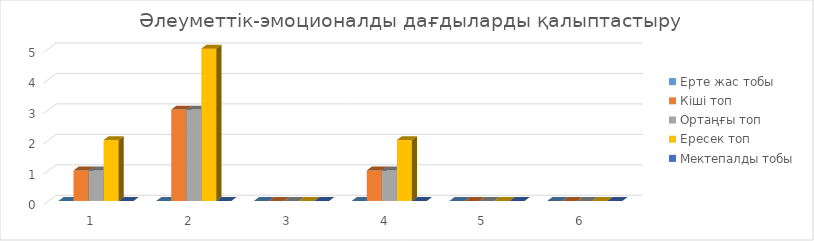
| Category | Ерте жас тобы  | Кіші топ | Ортаңғы топ | Ересек топ | Мектепалды тобы |
|---|---|---|---|---|---|
| 0 | 0 | 1 | 1 | 2 | 0 |
| 1 | 0 | 3 | 3 | 5 | 0 |
| 2 | 0 | 0 | 0 | 0 | 0 |
| 3 | 0 | 1 | 1 | 2 | 0 |
| 4 | 0 | 0 | 0 | 0 | 0 |
| 5 | 0 | 0 | 0 | 0 | 0 |